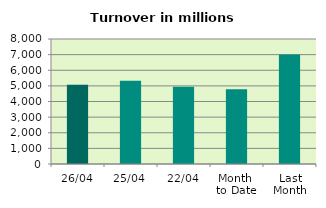
| Category | Series 0 |
|---|---|
| 26/04 | 5073.579 |
| 25/04 | 5320.827 |
| 22/04 | 4946.586 |
| Month 
to Date | 4783.679 |
| Last
Month | 7002.451 |